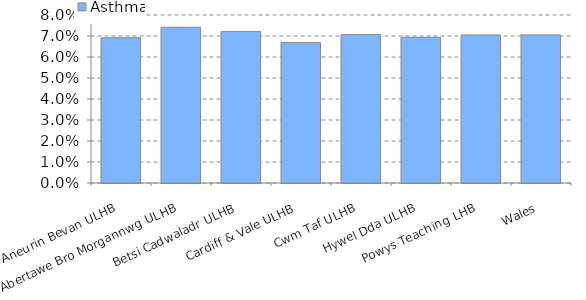
| Category | Asthma |
|---|---|
| Aneurin Bevan ULHB | 0.069 |
| Abertawe Bro Morgannwg ULHB | 0.074 |
| Betsi Cadwaladr ULHB | 0.072 |
| Cardiff & Vale ULHB | 0.067 |
| Cwm Taf ULHB | 0.071 |
| Hywel Dda ULHB | 0.069 |
| Powys Teaching LHB | 0.07 |
| Wales | 0.071 |